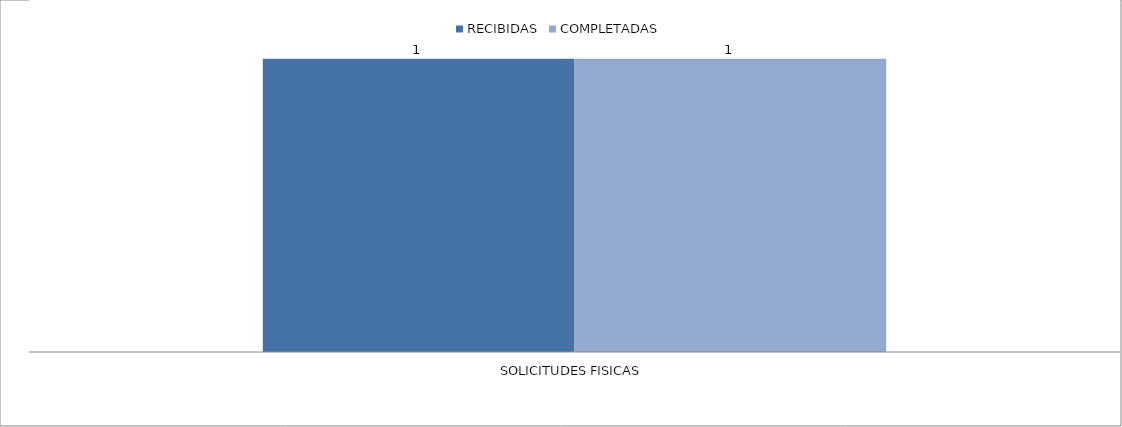
| Category | RECIBIDAS | COMPLETADAS |
|---|---|---|
| SOLICITUDES FISICAS | 1 | 1 |